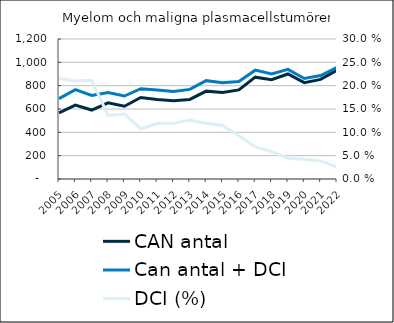
| Category |  CAN antal  |  Can antal + DCI  |
|---|---|---|
| 2005.0 | 567 | 689 |
| 2006.0 | 633 | 766 |
| 2007.0 | 591 | 716 |
| 2008.0 | 653 | 742 |
| 2009.0 | 624 | 711 |
| 2010.0 | 699 | 774 |
| 2011.0 | 682 | 763 |
| 2012.0 | 671 | 751 |
| 2013.0 | 682 | 768 |
| 2014.0 | 753 | 843 |
| 2015.0 | 741 | 826 |
| 2016.0 | 764 | 835 |
| 2017.0 | 873 | 933 |
| 2018.0 | 851 | 901 |
| 2019.0 | 900 | 940 |
| 2020.0 | 826 | 861 |
| 2021.0 | 854 | 887 |
| 2022.0 | 932 | 956 |